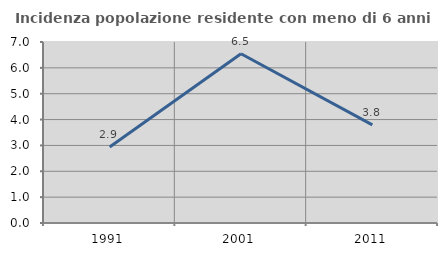
| Category | Incidenza popolazione residente con meno di 6 anni |
|---|---|
| 1991.0 | 2.941 |
| 2001.0 | 6.546 |
| 2011.0 | 3.795 |